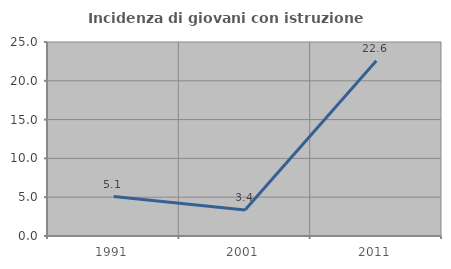
| Category | Incidenza di giovani con istruzione universitaria |
|---|---|
| 1991.0 | 5.085 |
| 2001.0 | 3.352 |
| 2011.0 | 22.581 |